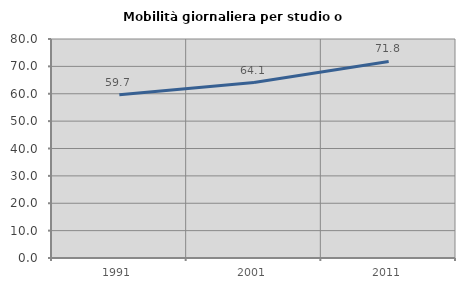
| Category | Mobilità giornaliera per studio o lavoro |
|---|---|
| 1991.0 | 59.674 |
| 2001.0 | 64.107 |
| 2011.0 | 71.791 |